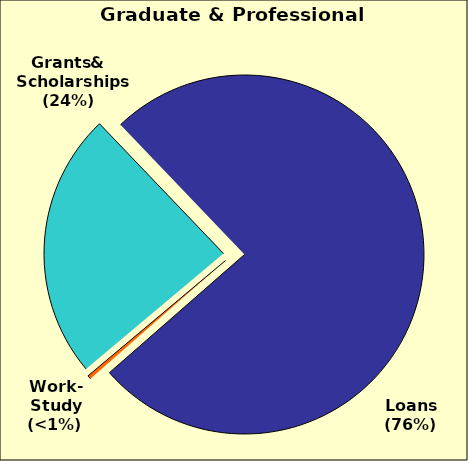
| Category | Series 0 |
|---|---|
| 0 | 0.24 |
| 1 | 0.757 |
| 2 | 0.003 |